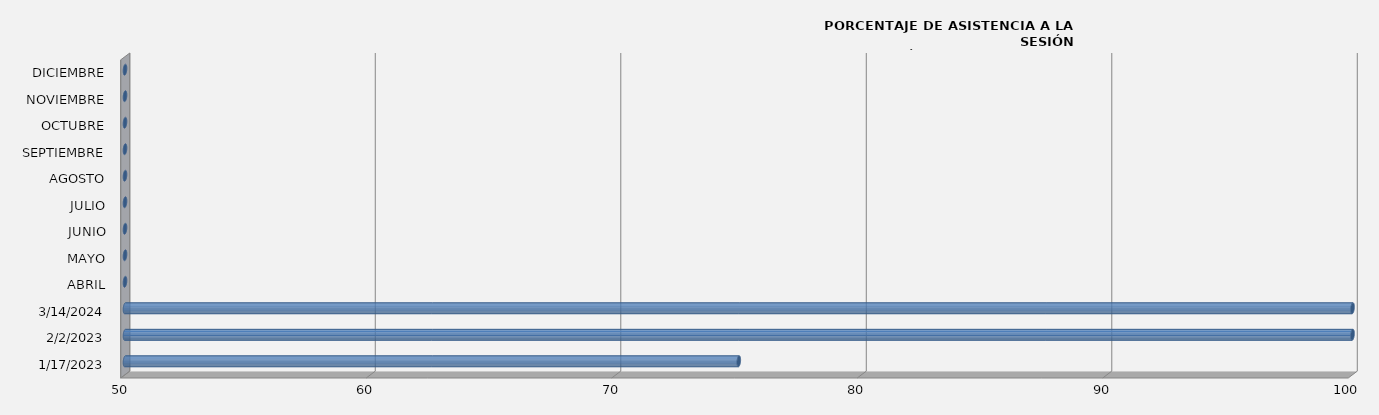
| Category | 17/01/2023 |
|---|---|
| 17/01/2023 | 75 |
| 02/02/2023 | 100 |
| 14/03/2024 | 100 |
| ABRIL | 0 |
| MAYO | 0 |
| JUNIO | 0 |
| JULIO | 0 |
| AGOSTO | 0 |
| SEPTIEMBRE | 0 |
| OCTUBRE | 0 |
| NOVIEMBRE | 0 |
| DICIEMBRE | 0 |